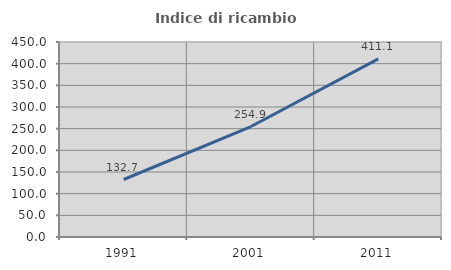
| Category | Indice di ricambio occupazionale  |
|---|---|
| 1991.0 | 132.676 |
| 2001.0 | 254.933 |
| 2011.0 | 411.131 |